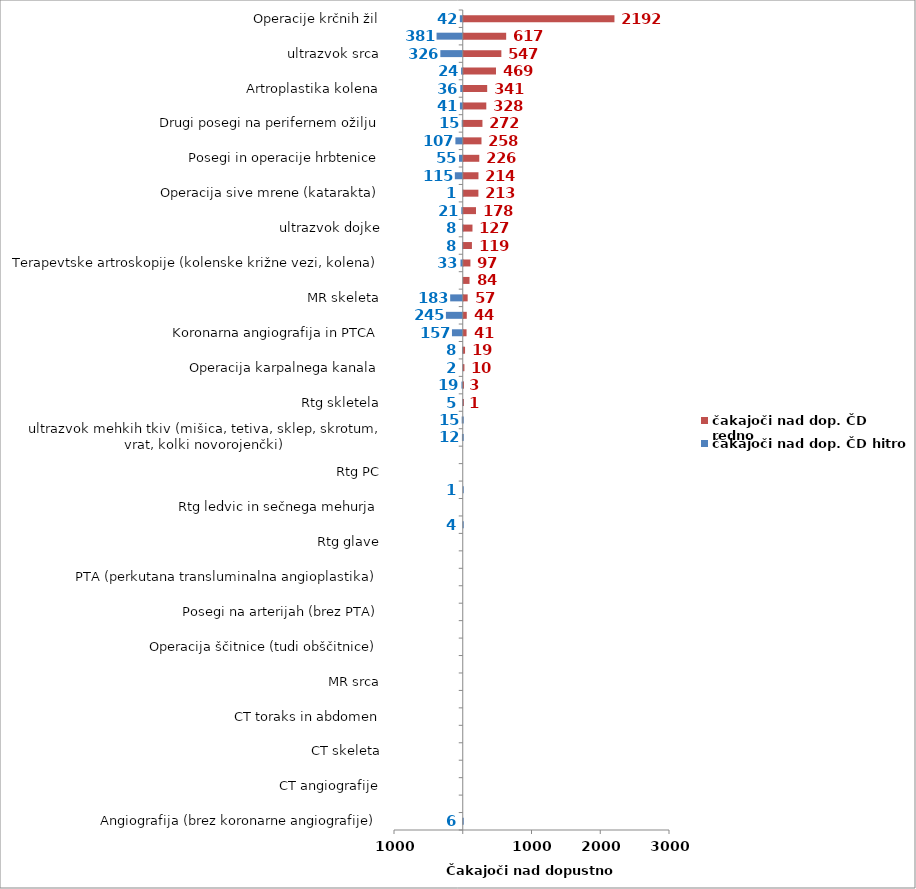
| Category | čakajoči nad dop. ČD hitro | čakajoči nad dop. ČD redno |
|---|---|---|
| Angiografija (brez koronarne angiografije) | -6 | 0 |
| Artroplastika gležnja | 0 | 0 |
| CT angiografije | 0 | 0 |
| CT glave in vratu | 0 | 0 |
| CT skeleta | 0 | 0 |
| CT srca | 0 | 0 |
| CT toraks in abdomen | 0 | 0 |
| Elektroencefalografija (EEG) | 0 | 0 |
| MR srca | 0 | 0 |
| MR toraks in abdomen | 0 | 0 |
| Operacija ščitnice (tudi obščitnice) | 0 | 0 |
| Operacije kile-otroci | 0 | 0 |
| Posegi na arterijah (brez PTA) | 0 | 0 |
| Posegi na ušesu in mastoidu | 0 | 0 |
| PTA (perkutana transluminalna angioplastika) | 0 | 0 |
| Rtg abdomna | 0 | 0 |
| Rtg glave | 0 | 0 |
| Rtg hrbtenice | -4 | 0 |
| Rtg ledvic in sečnega mehurja | 0 | 0 |
| Rtg mamografija | -1 | 0 |
| Rtg PC | 0 | 0 |
| Sklerozacija krčnih žil | 0 | 0 |
| ultrazvok mehkih tkiv (mišica, tetiva, sklep, skrotum, vrat, kolki novorojenčki) | -12 | 0 |
| ultrazvok rame | -15 | 0 |
| Rtg skletela | -5 | 1 |
| MR angiografije | -19 | 3 |
| Operacija karpalnega kanala | -2 | 10 |
| Operacije na odprtem srcu | -8 | 19 |
| Koronarna angiografija in PTCA | -157 | 41 |
| MR glave in vratu | -245 | 44 |
| MR skeleta | -183 | 57 |
| Posegi in operacije nosu in obnosnih votlin | 0 | 84 |
| Terapevtske artroskopije (kolenske križne vezi, kolena) | -33 | 97 |
| Operacije žolčnih kamnov | -8 | 119 |
| ultrazvok dojke | -8 | 127 |
| Ortopedska operacija rame (samo terapevstki posegi na rami) | -21 | 178 |
| Operacija sive mrene (katarakta) | -1 | 213 |
| ultrazvok vratnih žil | -115 | 214 |
| Posegi in operacije hrbtenice | -55 | 226 |
| Artroplastika kolka (protetika, endoproteza) | -107 | 258 |
| Drugi posegi na perifernem ožilju | -15 | 272 |
| Operacije kile-odrasli | -41 | 328 |
| Artroplastika kolena | -36 | 341 |
| Posegi in operacije v ustih, grlu in žrelu | -24 | 469 |
| ultrazvok srca | -326 | 547 |
| Elektromiografija (EMG) | -381 | 617 |
| Operacije krčnih žil | -42 | 2192 |